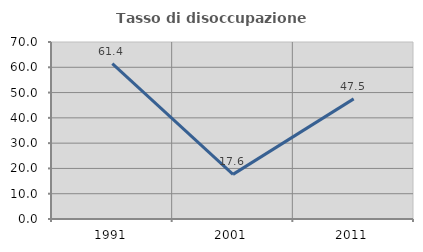
| Category | Tasso di disoccupazione giovanile  |
|---|---|
| 1991.0 | 61.429 |
| 2001.0 | 17.647 |
| 2011.0 | 47.5 |